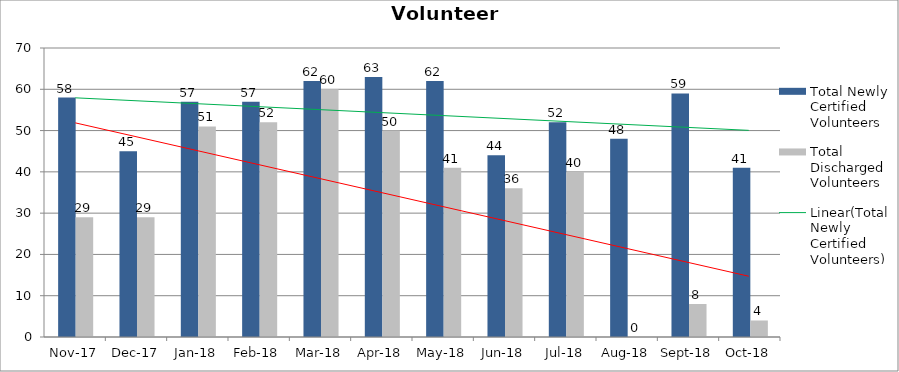
| Category | Total Newly Certified Volunteers | Total Discharged Volunteers |
|---|---|---|
| 2017-11-01 | 58 | 29 |
| 2017-12-01 | 45 | 29 |
| 2018-01-01 | 57 | 51 |
| 2018-02-01 | 57 | 52 |
| 2018-03-01 | 62 | 60 |
| 2018-04-01 | 63 | 50 |
| 2018-05-01 | 62 | 41 |
| 2018-06-01 | 44 | 36 |
| 2018-07-01 | 52 | 40 |
| 2018-08-01 | 48 | 0 |
| 2018-09-01 | 59 | 8 |
| 2018-10-01 | 41 | 4 |